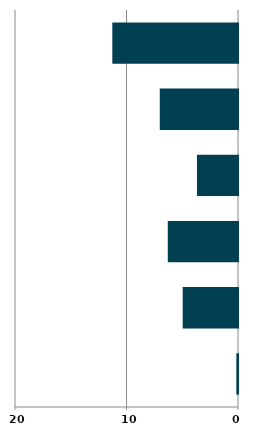
| Category | Series 0 |
|---|---|
| 0 | 0.15 |
| 1 | 4.962 |
| 2 | 6.297 |
| 3 | 3.68 |
| 4 | 7.017 |
| 5 | 11.273 |